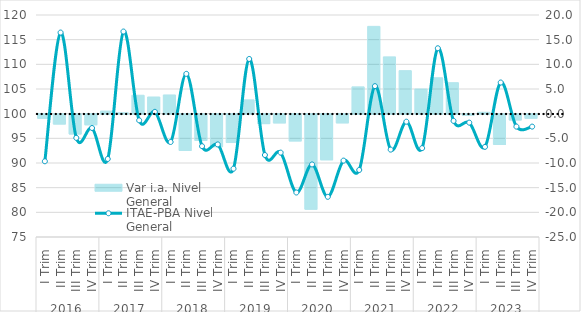
| Category | Var i.a. Nivel General |
|---|---|
| 0 | -0.828 |
| 1 | -1.996 |
| 2 | -4.016 |
| 3 | -2.151 |
| 4 | 0.517 |
| 5 | 0.177 |
| 6 | 3.734 |
| 7 | 3.379 |
| 8 | 3.792 |
| 9 | -7.353 |
| 10 | -5.311 |
| 11 | -6.586 |
| 12 | -5.749 |
| 13 | 2.797 |
| 14 | -1.916 |
| 15 | -1.769 |
| 16 | -5.426 |
| 17 | -19.251 |
| 18 | -9.249 |
| 19 | -1.76 |
| 20 | 5.431 |
| 21 | 17.691 |
| 22 | 11.511 |
| 23 | 8.715 |
| 24 | 5 |
| 25 | 7.276 |
| 26 | 6.281 |
| 27 | -0.19 |
| 28 | 0.281 |
| 29 | -6.131 |
| 30 | -1.173 |
| 31 | -0.822 |